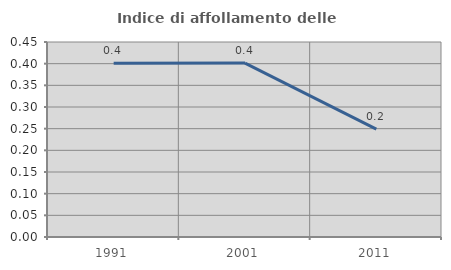
| Category | Indice di affollamento delle abitazioni  |
|---|---|
| 1991.0 | 0.401 |
| 2001.0 | 0.401 |
| 2011.0 | 0.249 |